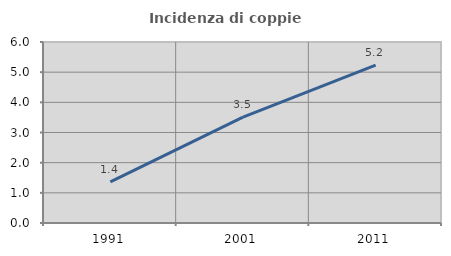
| Category | Incidenza di coppie miste |
|---|---|
| 1991.0 | 1.366 |
| 2001.0 | 3.512 |
| 2011.0 | 5.235 |